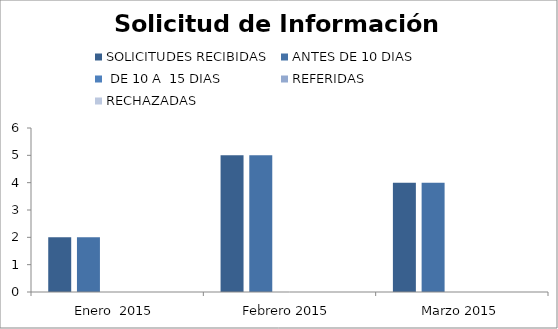
| Category | SOLICITUDES RECIBIDAS | ANTES DE 10 DIAS |  DE 10 A  15 DIAS  | REFERIDAS | RECHAZADAS |
|---|---|---|---|---|---|
| Enero  2015 | 2 | 2 | 0 | 0 | 0 |
| Febrero 2015 | 5 | 5 | 0 | 0 | 0 |
| Marzo 2015 | 4 | 4 | 0 | 0 | 0 |